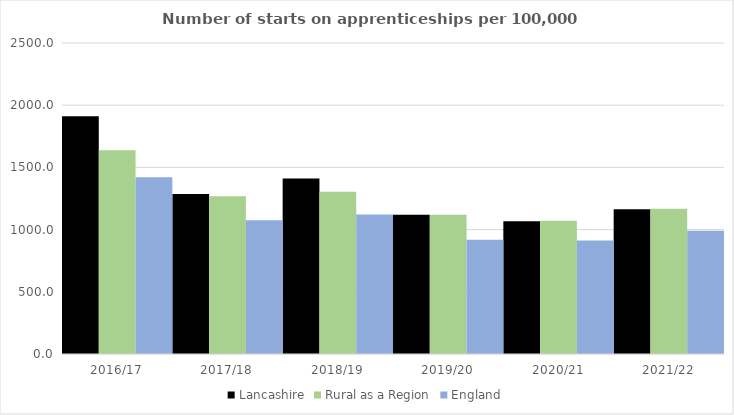
| Category | Lancashire | Rural as a Region | England |
|---|---|---|---|
| 2016/17 | 1910.639 | 1638.789 | 1420 |
| 2017/18 | 1285.934 | 1267.474 | 1075 |
| 2018/19 | 1410.282 | 1304.57 | 1122 |
| 2019/20 | 1120.072 | 1119.662 | 918 |
| 2020/21 | 1068.084 | 1070.748 | 912 |
| 2021/22 | 1164.036 | 1167.68 | 991 |